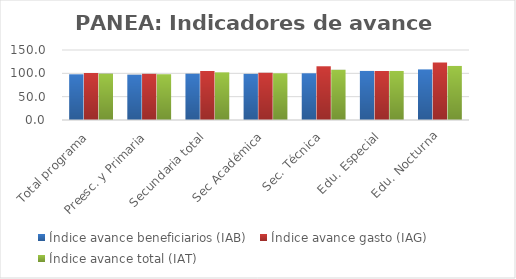
| Category | Índice avance beneficiarios (IAB)  | Índice avance gasto (IAG) | Índice avance total (IAT)  |
|---|---|---|---|
| Total programa | 97.925 | 100.736 | 99.331 |
| Preesc. y Primaria | 97.166 | 98.954 | 98.06 |
| Secundaria total | 99.231 | 105.006 | 102.119 |
| Sec Académica | 98.888 | 101.301 | 100.094 |
| Sec. Técnica | 100.095 | 115.127 | 107.611 |
| Edu. Especial | 105.145 | 105.019 | 105.082 |
| Edu. Nocturna | 108.426 | 123.218 | 115.822 |